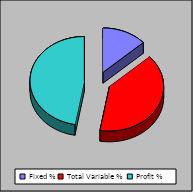
| Category | Series 0 |
|---|---|
| Fixed % | 0.133 |
| Total Variable % | 0.395 |
| Profit % | 0.472 |